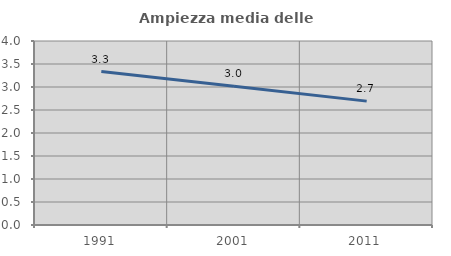
| Category | Ampiezza media delle famiglie |
|---|---|
| 1991.0 | 3.336 |
| 2001.0 | 3.017 |
| 2011.0 | 2.693 |